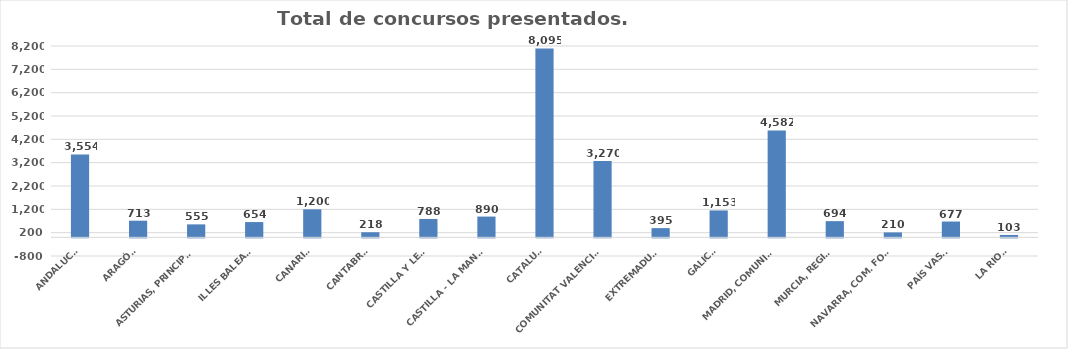
| Category | Series 0 |
|---|---|
| ANDALUCÍA | 3554 |
| ARAGÓN | 713 |
| ASTURIAS, PRINCIPADO | 555 |
| ILLES BALEARS | 654 |
| CANARIAS | 1200 |
| CANTABRIA | 218 |
| CASTILLA Y LEÓN | 788 |
| CASTILLA - LA MANCHA | 890 |
| CATALUÑA | 8095 |
| COMUNITAT VALENCIANA | 3270 |
| EXTREMADURA | 395 |
| GALICIA | 1153 |
| MADRID, COMUNIDAD | 4582 |
| MURCIA, REGIÓN | 694 |
| NAVARRA, COM. FORAL | 210 |
| PAÍS VASCO | 677 |
| LA RIOJA | 103 |